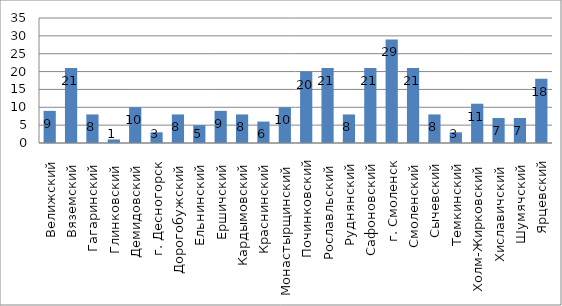
| Category | Кол-во школ |
|---|---|
| Велижский | 9 |
| Вяземский  | 21 |
| Гагаринский  | 8 |
| Глинковский  | 1 |
| Демидовский  | 10 |
| г. Десногорск | 3 |
| Дорогобужский  | 8 |
| Ельнинский  | 5 |
| Ершичский  | 9 |
| Кардымовский  | 8 |
| Краснинский  | 6 |
| Монастырщинский  | 10 |
| Починковский | 20 |
| Рославльский  | 21 |
| Руднянский  | 8 |
| Сафоновский  | 21 |
| г. Смоленск | 29 |
| Смоленский  | 21 |
| Сычевский  | 8 |
| Темкинский  | 3 |
| Холм-Жирковский  | 11 |
| Хиславичский  | 7 |
| Шумячский  | 7 |
| Ярцевский | 18 |